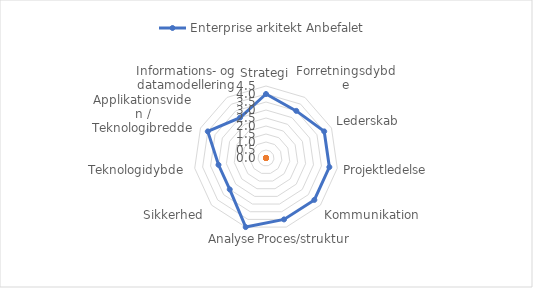
| Category | Enterprise arkitekt |
|---|---|
| Strategi |  |
| Forretningsdybde |  |
| Lederskab |  |
| Projektledelse |  |
| Kommunikation |  |
| Proces/struktur |  |
| Analyse |  |
| Sikkerhed |  |
| Teknologidybde |  |
| Applikationsviden / Teknologibredde |  |
| Informations- og datamodellering |  |